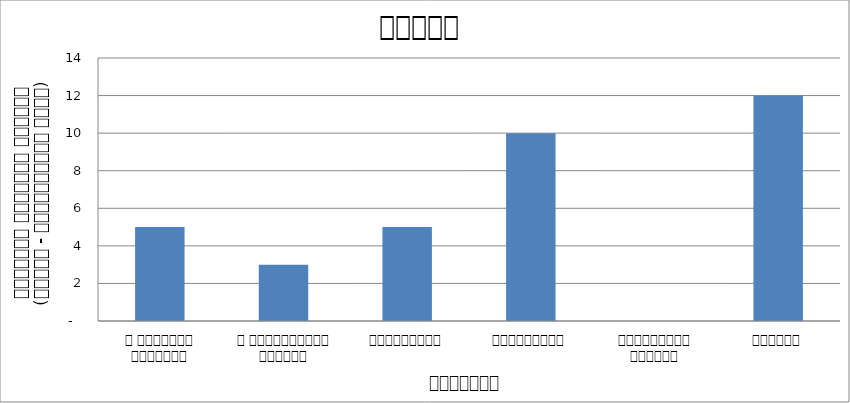
| Category | न्याय |
|---|---|
| द हिमालयन टाइम्स् | 5 |
| द काठमाण्डौं पोस्ट् | 3 |
| रिपब्लिका | 5 |
| कान्तिपुर | 10 |
| अन्नपूर्ण पोस्ट् | 0 |
| नागरिक | 12 |